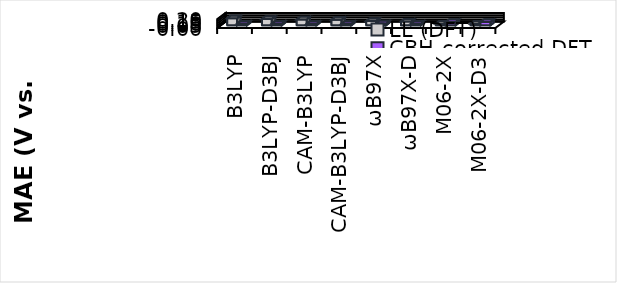
| Category | LL (DFT) | CBH-corrected DFT |
|---|---|---|
| B3LYP | 0.163 | 0.039 |
| B3LYP-D3BJ | 0.147 | 0.04 |
| CAM-B3LYP | 0.137 | 0.034 |
| CAM-B3LYP-D3BJ | 0.127 | 0.035 |
| ωB97X | 0.101 | 0.044 |
| ωB97X-D | 0.089 | 0.042 |
| M06-2X | 0.039 | 0.079 |
| M06-2X-D3 | 0.038 | 0.079 |